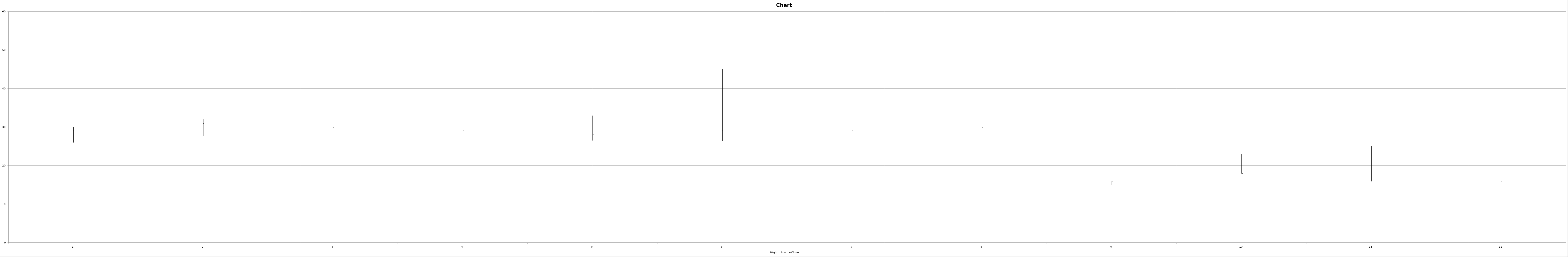
| Category | High | Low | Close |
|---|---|---|---|
| Jan | 30 | 26 | 29 |
| Feb | 32 | 27.7 | 31 |
| Mar | 35 | 27.29 | 30 |
| Apr | 39 | 27.15 | 29 |
| May | 33 | 26.53 | 28 |
| Jun | 45 | 26.38 | 29 |
| Jul | 50 | 26.4 | 29 |
| Aug | 45 | 26.24 | 30 |
| Sep | 16 | 15 | 16 |
| Oct | 23 | 18 | 18 |
| Nov | 25 | 16 | 16 |
| Dec | 20 | 14 | 16 |